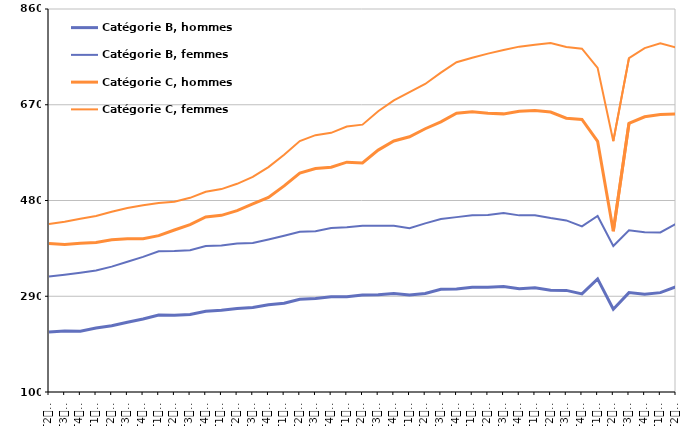
| Category | Catégorie B, hommes | Catégorie B, femmes | Catégorie C, hommes | Catégorie C, femmes |
|---|---|---|---|---|
| T2
2011 | 219 | 329.4 | 394.7 | 433.2 |
| T3
2011 | 221.1 | 332.8 | 392.8 | 438 |
| T4
2011 | 220.4 | 336.7 | 395.3 | 443.8 |
| T1
2012 | 226.8 | 341 | 396.6 | 449.4 |
| T2
2012 | 231.6 | 348.8 | 402 | 457.5 |
| T3
2012 | 238.3 | 358.3 | 403.9 | 465 |
| T4
2012 | 244.8 | 368.1 | 404.3 | 470.6 |
| T1
2013 | 252.6 | 379.3 | 410.3 | 475 |
| T2
2013 | 252.5 | 379.6 | 421.4 | 477.5 |
| T3
2013 | 254 | 381.5 | 432 | 485.3 |
| T4
2013 | 260.4 | 389.8 | 447.3 | 497.4 |
| T1
2014 | 262 | 390.7 | 450.5 | 502.6 |
| T2
2014 | 265.8 | 394.6 | 459.9 | 513.1 |
| T3
2014 | 267.9 | 395.7 | 473.3 | 526.7 |
| T4
2014 | 273 | 402.6 | 486 | 546.3 |
| T1
2015 | 276.3 | 410 | 509.1 | 570.7 |
| T2
2015 | 284.2 | 417.8 | 534.4 | 597.9 |
| T3
2015 | 285.6 | 419.2 | 543.5 | 609.7 |
| T4
2015 | 289 | 425.3 | 546.1 | 614.3 |
| T1
2016 | 288.8 | 426.7 | 556.1 | 626.9 |
| T2
2016 | 292.4 | 430.1 | 554.4 | 630.5 |
| T3
2016 | 293.1 | 430.1 | 580 | 657.1 |
| T4
2016 | 295.4 | 430 | 598.2 | 678.5 |
| T1
2017 | 292.6 | 424.9 | 606.4 | 695.1 |
| T2
2017 | 295.6 | 434.6 | 622.4 | 711.3 |
| T3
2017 | 303.9 | 443.4 | 636.1 | 733.7 |
| T4
2017 | 304.2 | 447 | 653.1 | 754.5 |
| T1
2018 | 308 | 450.9 | 655.9 | 763.1 |
| T2
2018 | 308 | 451.1 | 653.3 | 771.5 |
| T3
2018 | 309.3 | 455.3 | 651.9 | 778.5 |
| T4
2018 | 304.9 | 450.5 | 657.3 | 785.3 |
| T1
2019 | 306.9 | 450.9 | 658.8 | 789 |
| T2
2019 | 302 | 445.2 | 655.6 | 792.3 |
| T3
2019 | 301.6 | 440.5 | 643.4 | 784.5 |
| T4
2019 | 294.7 | 428.5 | 640.9 | 781.2 |
| T1
2020 | 324.4 | 449.2 | 597.3 | 743.2 |
| T2
2020 | 264.2 | 389.8 | 419 | 597.7 |
| T3
2020 | 297.2 | 421 | 633.1 | 762.6 |
| T4
2020 | 294 | 416.8 | 646.2 | 782.4 |
| T1
2021 | 297.2 | 416.7 | 650.6 | 791.9 |
| T2
2021 | 309 | 433.7 | 651.9 | 783.7 |